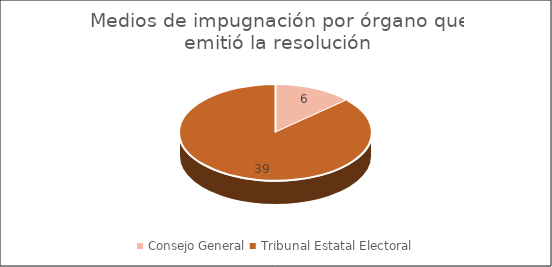
| Category | Medios de impugnación por órgano que emitió la resolución |
|---|---|
| Consejo General | 6 |
| Tribunal Estatal Electoral | 39 |